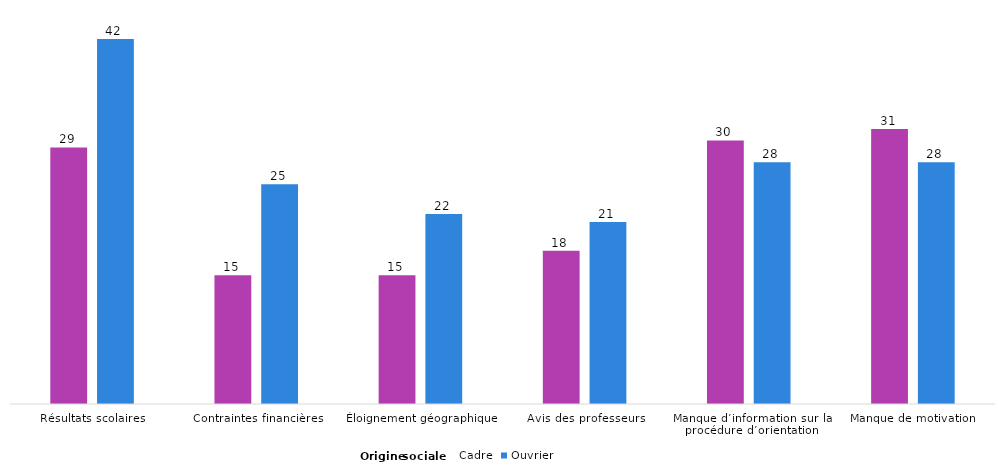
| Category | Cadre | Ouvrier |
|---|---|---|
| Résultats scolaires | 29.3 | 41.7 |
| Contraintes financières | 14.7 | 25.1 |
| Éloignement géographique | 14.7 | 21.7 |
| Avis des professeurs | 17.5 | 20.8 |
| Manque d’information sur la procédure d’orientation | 30.1 | 27.6 |
| Manque de motivation | 31.4 | 27.6 |